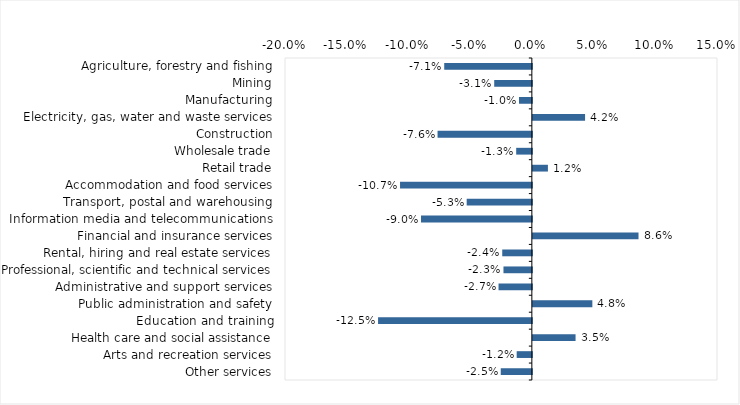
| Category | This week |
|---|---|
| Agriculture, forestry and fishing | -0.071 |
| Mining | -0.03 |
| Manufacturing | -0.01 |
| Electricity, gas, water and waste services | 0.042 |
| Construction | -0.076 |
| Wholesale trade | -0.013 |
| Retail trade | 0.012 |
| Accommodation and food services | -0.107 |
| Transport, postal and warehousing | -0.053 |
| Information media and telecommunications | -0.09 |
| Financial and insurance services | 0.086 |
| Rental, hiring and real estate services | -0.024 |
| Professional, scientific and technical services | -0.023 |
| Administrative and support services | -0.027 |
| Public administration and safety | 0.048 |
| Education and training | -0.125 |
| Health care and social assistance | 0.035 |
| Arts and recreation services | -0.012 |
| Other services | -0.025 |